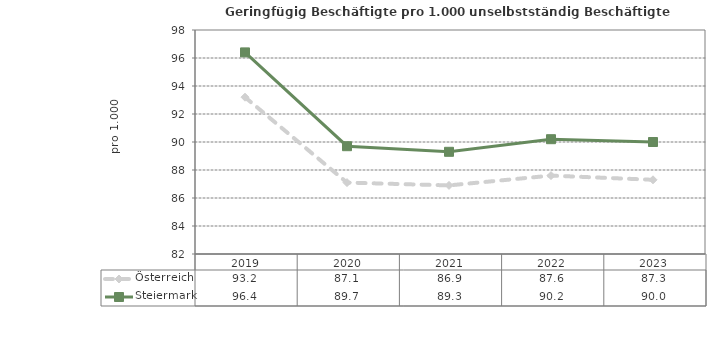
| Category | Österreich | Steiermark |
|---|---|---|
| 2023.0 | 87.3 | 90 |
| 2022.0 | 87.6 | 90.2 |
| 2021.0 | 86.9 | 89.3 |
| 2020.0 | 87.1 | 89.7 |
| 2019.0 | 93.2 | 96.4 |